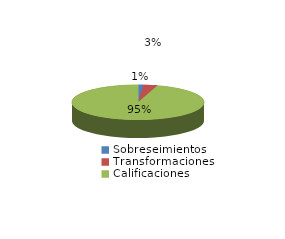
| Category | Series 0 |
|---|---|
| Sobreseimientos | 2 |
| Transformaciones | 5 |
| Calificaciones | 143 |